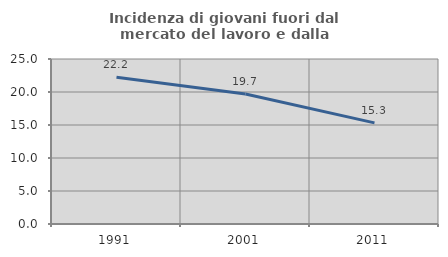
| Category | Incidenza di giovani fuori dal mercato del lavoro e dalla formazione  |
|---|---|
| 1991.0 | 22.249 |
| 2001.0 | 19.694 |
| 2011.0 | 15.318 |